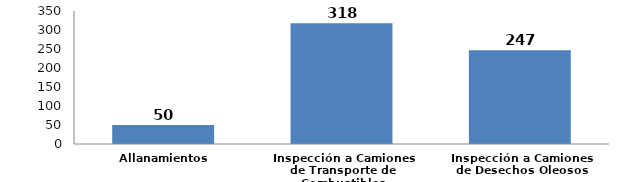
| Category | Series 0 |
|---|---|
| Allanamientos | 50 |
| Inspección a Camiones de Transporte de Combustibles | 318 |
| Inspección a Camiones de Desechos Oleosos | 247 |